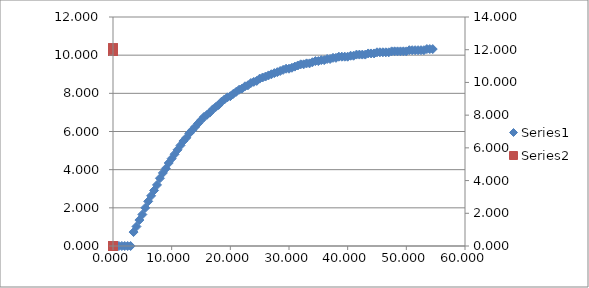
| Category | Series 0 |
|---|---|
| 0.5 | 0 |
| 1.0 | 0 |
| 1.5 | 0 |
| 2.0 | 0 |
| 2.5 | 0 |
| 3.0 | 0 |
| 3.5 | 0.73 |
| 4.0 | 1.02 |
| 4.5 | 1.36 |
| 5.0 | 1.65 |
| 5.5 | 2 |
| 6.0 | 2.34 |
| 6.5 | 2.63 |
| 7.0 | 2.91 |
| 7.5 | 3.2 |
| 8.0 | 3.55 |
| 8.5 | 3.83 |
| 9.0 | 4.06 |
| 9.5 | 4.35 |
| 10.0 | 4.58 |
| 10.5 | 4.81 |
| 11.0 | 5.04 |
| 11.5 | 5.27 |
| 12.0 | 5.5 |
| 12.5 | 5.67 |
| 13.0 | 5.9 |
| 13.5 | 6.07 |
| 14.0 | 6.24 |
| 14.5 | 6.42 |
| 15.0 | 6.59 |
| 15.5 | 6.76 |
| 16.0 | 6.87 |
| 16.5 | 6.99 |
| 17.0 | 7.16 |
| 17.5 | 7.28 |
| 18.0 | 7.39 |
| 18.5 | 7.56 |
| 19.0 | 7.68 |
| 19.5 | 7.79 |
| 20.0 | 7.85 |
| 20.5 | 7.97 |
| 21.0 | 8.08 |
| 21.5 | 8.19 |
| 22.0 | 8.25 |
| 22.5 | 8.37 |
| 23.0 | 8.42 |
| 23.5 | 8.54 |
| 24.0 | 8.6 |
| 24.5 | 8.65 |
| 25.0 | 8.77 |
| 25.5 | 8.83 |
| 26.0 | 8.88 |
| 26.5 | 8.94 |
| 27.0 | 9 |
| 27.5 | 9.06 |
| 28.0 | 9.11 |
| 28.5 | 9.17 |
| 29.0 | 9.23 |
| 29.5 | 9.29 |
| 30.0 | 9.29 |
| 30.5 | 9.34 |
| 31.0 | 9.4 |
| 31.5 | 9.46 |
| 32.0 | 9.52 |
| 32.5 | 9.52 |
| 33.0 | 9.57 |
| 33.5 | 9.57 |
| 34.0 | 9.63 |
| 34.5 | 9.69 |
| 35.0 | 9.69 |
| 35.5 | 9.74 |
| 36.0 | 9.74 |
| 36.5 | 9.8 |
| 37.0 | 9.8 |
| 37.5 | 9.86 |
| 38.0 | 9.86 |
| 38.5 | 9.92 |
| 39.0 | 9.92 |
| 39.5 | 9.92 |
| 40.0 | 9.92 |
| 40.5 | 9.97 |
| 41.0 | 9.97 |
| 41.5 | 10.03 |
| 42.0 | 10.03 |
| 42.5 | 10.03 |
| 43.0 | 10.03 |
| 43.5 | 10.09 |
| 44.0 | 10.09 |
| 44.5 | 10.09 |
| 45.0 | 10.15 |
| 45.5 | 10.15 |
| 46.0 | 10.15 |
| 46.5 | 10.15 |
| 47.0 | 10.15 |
| 47.5 | 10.2 |
| 48.0 | 10.2 |
| 48.5 | 10.2 |
| 49.0 | 10.2 |
| 49.5 | 10.2 |
| 50.0 | 10.2 |
| 50.5 | 10.26 |
| 51.0 | 10.26 |
| 51.5 | 10.26 |
| 52.0 | 10.26 |
| 52.5 | 10.26 |
| 53.0 | 10.26 |
| 53.5 | 10.32 |
| 54.0 | 10.32 |
| 54.5 | 10.32 |